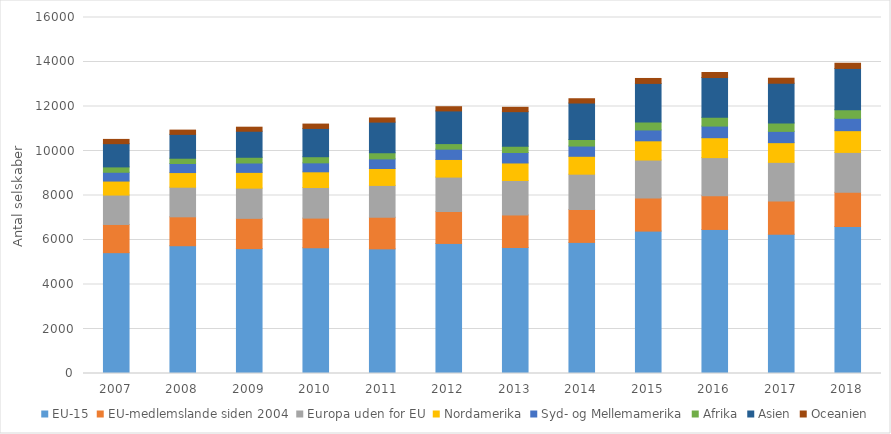
| Category | EU-15 | EU-medlemslande siden 2004 | Europa uden for EU | Nordamerika | Syd- og Mellemamerika | Afrika | Asien | Oceanien |
|---|---|---|---|---|---|---|---|---|
| 2007 | 5431 | 1267 | 1322 | 629 | 395 | 241 | 1045 | 191 |
| 2008 | 5743 | 1299 | 1331 | 658 | 407 | 237 | 1073 | 191 |
| 2009 | 5613 | 1360 | 1358 | 708 | 422 | 257 | 1170 | 182 |
| 2010 | 5651 | 1333 | 1375 | 706 | 403 | 275 | 1272 | 195 |
| 2011 | 5602 | 1421 | 1430 | 761 | 431 | 276 | 1377 | 187 |
| 2012 | 5845 | 1431 | 1552 | 792 | 463 | 250 | 1468 | 189 |
| 2013 | 5662 | 1463 | 1548 | 789 | 471 | 280 | 1555 | 196 |
| 2014 | 5892 | 1479 | 1587 | 804 | 461 | 297 | 1636 | 193 |
| 2015 | 6400 | 1488 | 1705 | 865 | 489 | 353 | 1738 | 222 |
| 2016 | 6474 | 1520 | 1709 | 895 | 522 | 395 | 1786 | 226 |
| 2017 | 6259 | 1492 | 1739 | 885 | 507 | 378 | 1786 | 225 |
| 2018 | 6607 | 1538 | 1792 | 977 | 556 | 385 | 1856 | 233 |